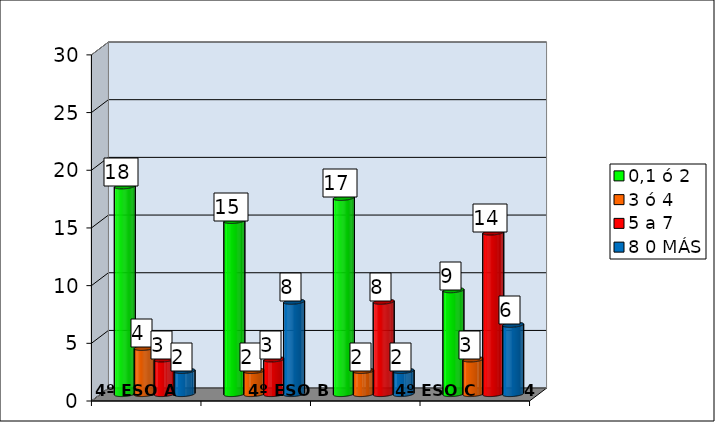
| Category | 0,1 ó 2  | 3 ó 4 | 5 a 7 | 8 0 MÁS |
|---|---|---|---|---|
|  | 18 | 4 | 3 | 2 |
|  | 15 | 2 | 3 | 8 |
|  | 17 | 2 | 8 | 2 |
|  | 9 | 3 | 14 | 6 |